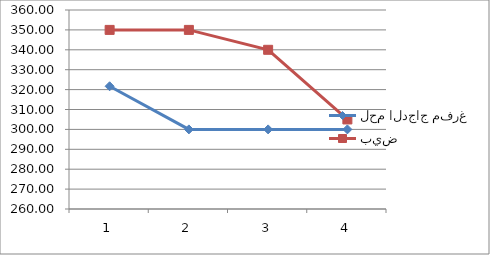
| Category | لحم الدجاج مفرغ | بيض |
|---|---|---|
| 0 | 321.67 | 350 |
| 1 | 300 | 350 |
| 2 | 300 | 340 |
| 3 | 300 | 305 |